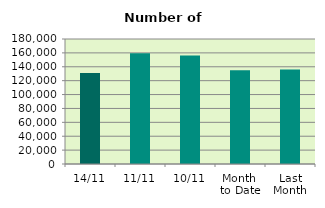
| Category | Series 0 |
|---|---|
| 14/11 | 131128 |
| 11/11 | 159534 |
| 10/11 | 156238 |
| Month 
to Date | 135115.8 |
| Last
Month | 136171.238 |